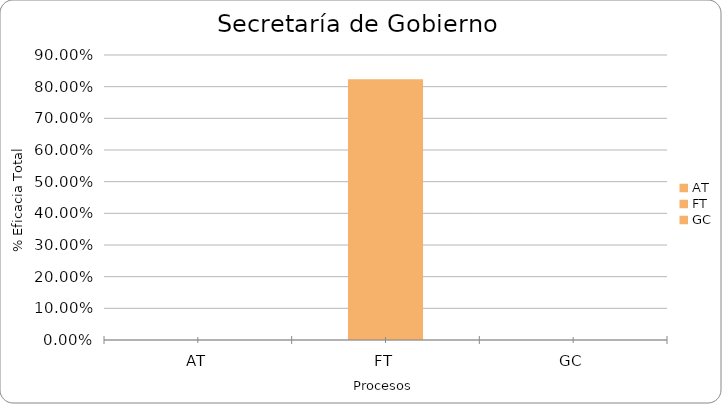
| Category | % Eficacia total |
|---|---|
| AT | 0 |
| FT | 0.824 |
| GC | 0 |